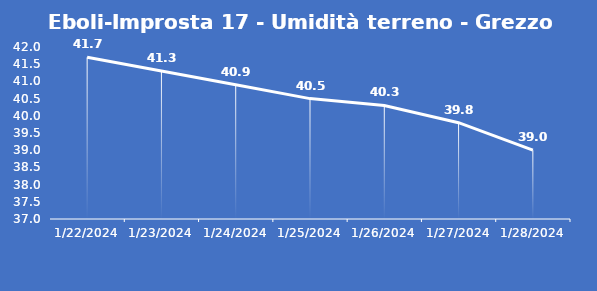
| Category | Eboli-Improsta 17 - Umidità terreno - Grezzo (%VWC) |
|---|---|
| 1/22/24 | 41.7 |
| 1/23/24 | 41.3 |
| 1/24/24 | 40.9 |
| 1/25/24 | 40.5 |
| 1/26/24 | 40.3 |
| 1/27/24 | 39.8 |
| 1/28/24 | 39 |